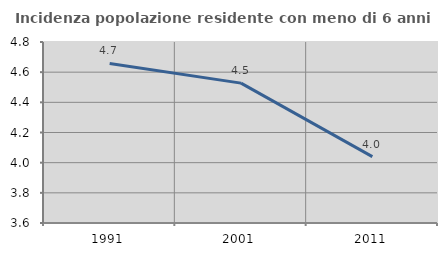
| Category | Incidenza popolazione residente con meno di 6 anni |
|---|---|
| 1991.0 | 4.658 |
| 2001.0 | 4.527 |
| 2011.0 | 4.04 |